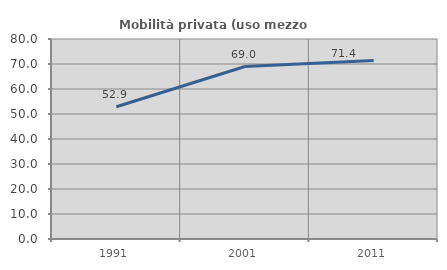
| Category | Mobilità privata (uso mezzo privato) |
|---|---|
| 1991.0 | 52.913 |
| 2001.0 | 68.981 |
| 2011.0 | 71.399 |